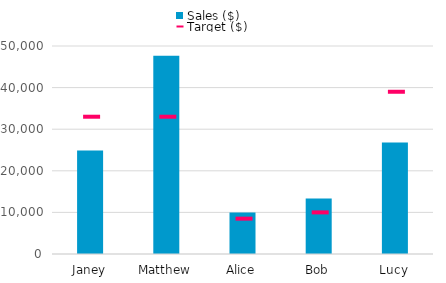
| Category | Sales ($) |
|---|---|
| Janey | 24897 |
| Matthew | 47666 |
| Alice | 9950 |
| Bob | 13333 |
| Lucy | 26800 |